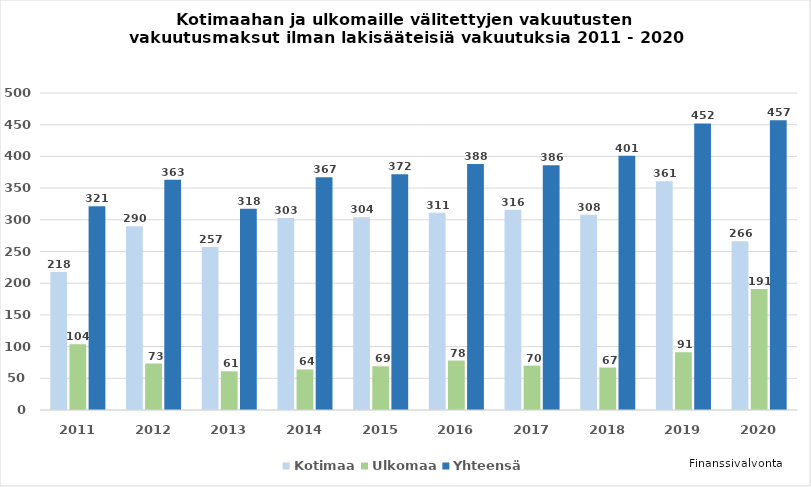
| Category | Kotimaa | Ulkomaa | Yhteensä  |
|---|---|---|---|
| 2011.0 | 217.55 | 103.894 | 321.444 |
| 2012.0 | 289.922 | 73.321 | 363.243 |
| 2013.0 | 257 | 61 | 317.523 |
| 2014.0 | 303 | 64 | 367 |
| 2015.0 | 304 | 69 | 372 |
| 2016.0 | 311 | 78 | 388 |
| 2017.0 | 316 | 70 | 386 |
| 2018.0 | 308 | 67 | 401 |
| 2019.0 | 361 | 91 | 452 |
| 2020.0 | 266 | 191 | 457 |